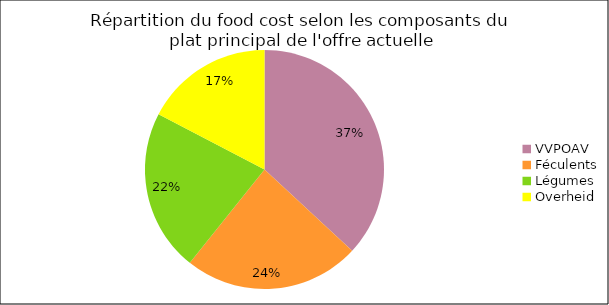
| Category | Column C |
|---|---|
| VVPOAV | 0.369 |
| Féculents | 0.238 |
| Légumes | 0.219 |
| Overheid | 0.173 |